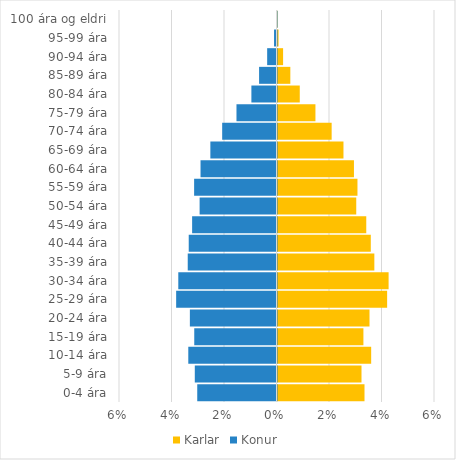
| Category | Karlar | Konur |
|---|---|---|
| 0-4 ára | 0.033 | -0.03 |
| 5-9 ára | 0.032 | -0.031 |
| 10-14 ára | 0.036 | -0.034 |
| 15-19 ára | 0.033 | -0.031 |
| 20-24 ára | 0.035 | -0.033 |
| 25-29 ára | 0.042 | -0.038 |
| 30-34 ára | 0.042 | -0.037 |
| 35-39 ára | 0.037 | -0.034 |
| 40-44 ára | 0.036 | -0.033 |
| 45-49 ára | 0.034 | -0.032 |
| 50-54 ára | 0.03 | -0.029 |
| 55-59 ára | 0.03 | -0.031 |
| 60-64 ára | 0.029 | -0.029 |
| 65-69 ára | 0.025 | -0.025 |
| 70-74 ára | 0.021 | -0.021 |
| 75-79 ára | 0.014 | -0.015 |
| 80-84 ára | 0.008 | -0.01 |
| 85-89 ára | 0.005 | -0.007 |
| 90-94 ára | 0.002 | -0.004 |
| 95-99 ára | 0 | -0.001 |
| 100 ára og eldri | 0 | 0 |